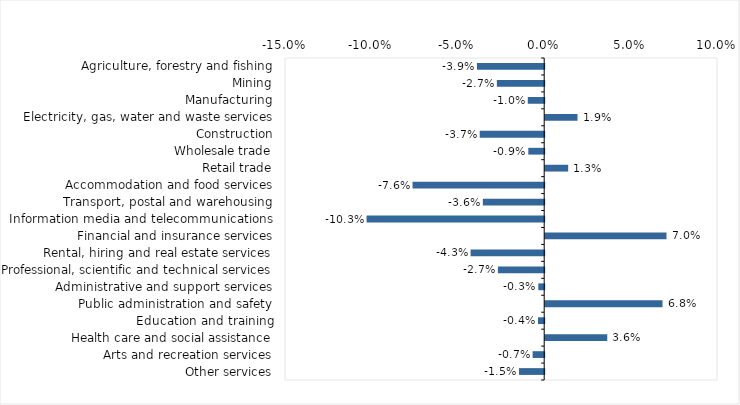
| Category | This week |
|---|---|
| Agriculture, forestry and fishing | -0.039 |
| Mining | -0.027 |
| Manufacturing | -0.01 |
| Electricity, gas, water and waste services | 0.019 |
| Construction | -0.037 |
| Wholesale trade | -0.009 |
| Retail trade | 0.013 |
| Accommodation and food services | -0.076 |
| Transport, postal and warehousing | -0.036 |
| Information media and telecommunications | -0.103 |
| Financial and insurance services | 0.07 |
| Rental, hiring and real estate services | -0.043 |
| Professional, scientific and technical services | -0.027 |
| Administrative and support services | -0.003 |
| Public administration and safety | 0.068 |
| Education and training | -0.004 |
| Health care and social assistance | 0.036 |
| Arts and recreation services | -0.007 |
| Other services | -0.015 |